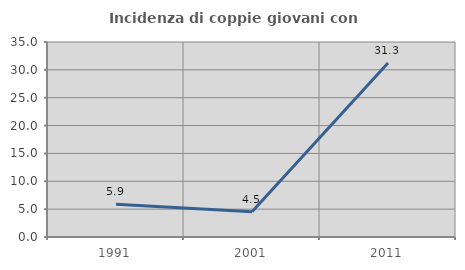
| Category | Incidenza di coppie giovani con figli |
|---|---|
| 1991.0 | 5.882 |
| 2001.0 | 4.545 |
| 2011.0 | 31.25 |